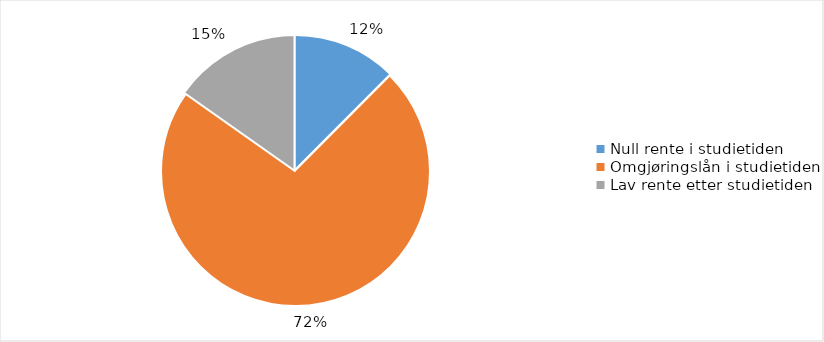
| Category | Series 0 |
|---|---|
| Null rente i studietiden | 0.125 |
| Omgjøringslån i studietiden | 0.723 |
| Lav rente etter studietiden | 0.152 |